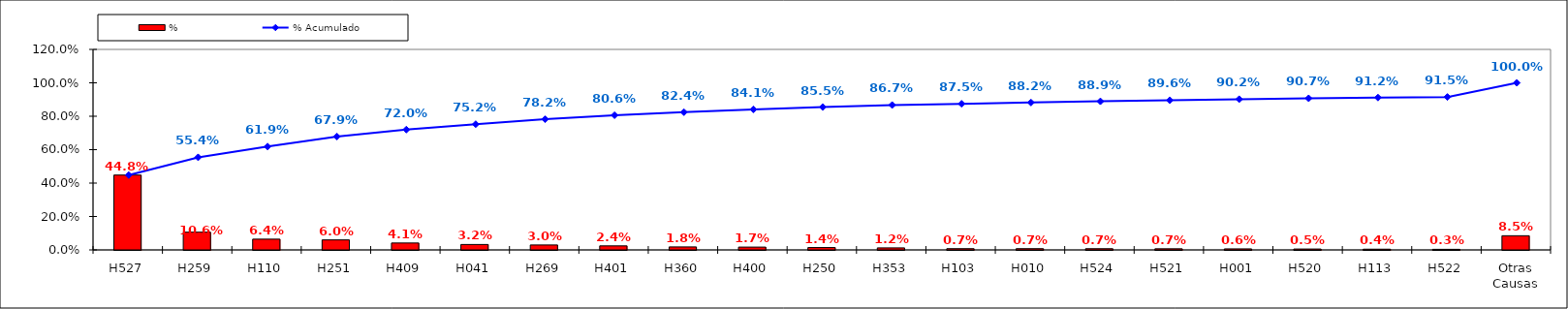
| Category | % |
|---|---|
| H527 | 0.448 |
| H259 | 0.106 |
| H110 | 0.064 |
| H251 | 0.06 |
| H409 | 0.041 |
| H041 | 0.032 |
| H269 | 0.03 |
| H401 | 0.024 |
| H360 | 0.018 |
| H400 | 0.017 |
| H250 | 0.014 |
| H353 | 0.012 |
| H103 | 0.007 |
| H010 | 0.007 |
| H524 | 0.007 |
| H521 | 0.007 |
| H001 | 0.006 |
| H520 | 0.005 |
| H113 | 0.004 |
| H522 | 0.003 |
| Otras Causas | 0.085 |